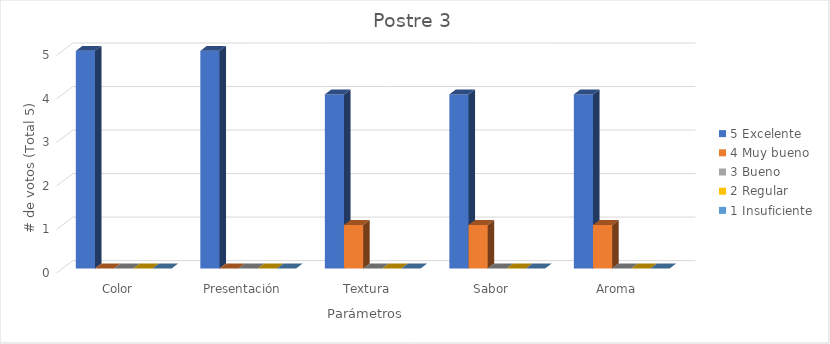
| Category | 5 | 4 | 3 | 2 | 1 |
|---|---|---|---|---|---|
| Color | 5 | 0 | 0 | 0 | 0 |
| Presentación | 5 | 0 | 0 | 0 | 0 |
| Textura | 4 | 1 | 0 | 0 | 0 |
| Sabor | 4 | 1 | 0 | 0 | 0 |
| Aroma | 4 | 1 | 0 | 0 | 0 |